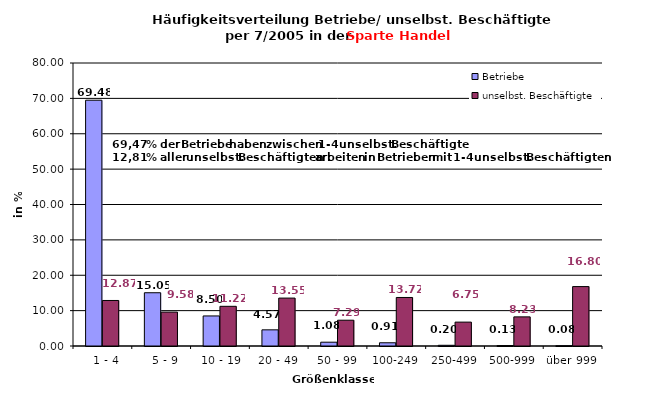
| Category | Betriebe | unselbst. Beschäftigte |
|---|---|---|
|   1 - 4 | 69.479 | 12.871 |
|   5 - 9 | 15.053 | 9.583 |
|  10 - 19 | 8.497 | 11.216 |
| 20 - 49 | 4.568 | 13.545 |
| 50 - 99 | 1.077 | 7.289 |
| 100-249 | 0.911 | 13.717 |
| 250-499 | 0.201 | 6.749 |
| 500-999 | 0.13 | 8.234 |
| über 999 | 0.083 | 16.796 |